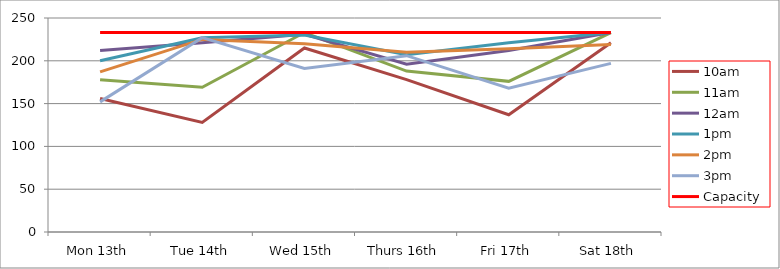
| Category | 9am | 10am | 11am | 12am | 1pm | 2pm | 3pm | 4pm | 5pm | Capacity |
|---|---|---|---|---|---|---|---|---|---|---|
| Mon 13th |  | 156 | 178 | 212 | 200 | 187 | 152 |  |  | 233 |
| Tue 14th |  | 128 | 169 | 221 | 227 | 225 | 227 |  |  | 233 |
| Wed 15th |  | 215 | 233 | 231 | 230 | 220 | 191 |  |  | 233 |
| Thurs 16th |  | 178 | 188 | 196 | 207 | 210 | 206 |  |  | 233 |
| Fri 17th |  | 137 | 176 | 212 | 221 | 214 | 168 |  |  | 233 |
| Sat 18th |  | 221 | 233 | 233 | 233 | 219 | 197 |  |  | 233 |